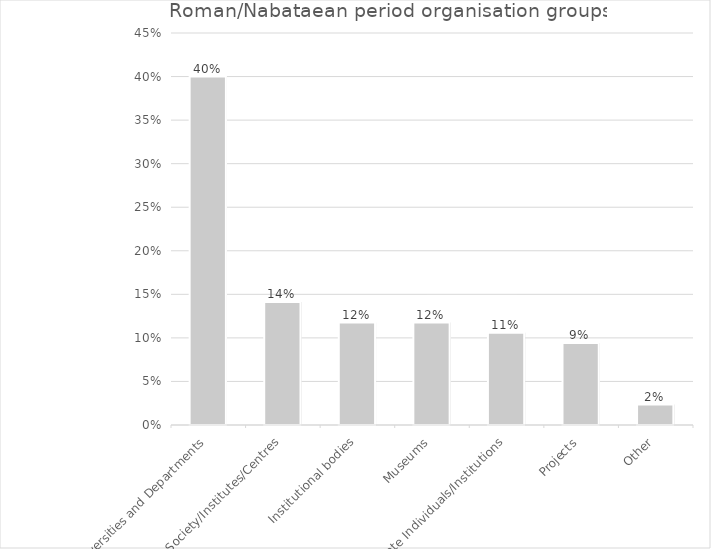
| Category | Series 2 |
|---|---|
| Universities and Departments | 0.4 |
| Society/Institutes/Centres | 0.141 |
| Institutional bodies | 0.118 |
| Museums | 0.118 |
| Private Individuals/Institutions | 0.106 |
| Projects | 0.094 |
| Other | 0.024 |